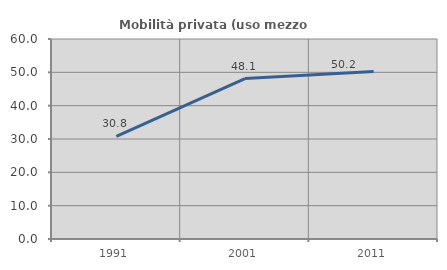
| Category | Mobilità privata (uso mezzo privato) |
|---|---|
| 1991.0 | 30.753 |
| 2001.0 | 48.132 |
| 2011.0 | 50.216 |